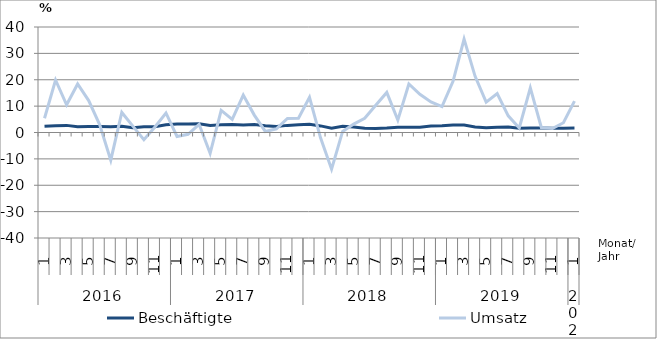
| Category | Beschäftigte | Umsatz |
|---|---|---|
| 0 | 2.4 | 5.4 |
| 1 | 2.6 | 19.9 |
| 2 | 2.7 | 10.5 |
| 3 | 2.2 | 18.4 |
| 4 | 2.3 | 12.1 |
| 5 | 2.3 | 2.9 |
| 6 | 2.2 | -10.5 |
| 7 | 2.4 | 7.6 |
| 8 | 1.8 | 2.4 |
| 9 | 2.2 | -2.7 |
| 10 | 2.2 | 2.1 |
| 11 | 2.9 | 7.4 |
| 12 | 3.2 | -1.5 |
| 13 | 3.2 | -0.7 |
| 14 | 3.3 | 3.1 |
| 15 | 2.7 | -7.9 |
| 16 | 2.9 | 8.4 |
| 17 | 3 | 5 |
| 18 | 2.8 | 14.2 |
| 19 | 3 | 6.6 |
| 20 | 2.6 | 0.4 |
| 21 | 2.3 | 1.4 |
| 22 | 2.7 | 5.3 |
| 23 | 2.9 | 5.4 |
| 24 | 3.1 | 13.3 |
| 25 | 2.5 | -2 |
| 26 | 1.6 | -13.9 |
| 27 | 2.4 | 0.4 |
| 28 | 2.1 | 3.2 |
| 29 | 1.6 | 5.4 |
| 30 | 1.5 | 10.3 |
| 31 | 1.7 | 15.2 |
| 32 | 2 | 4.7 |
| 33 | 2 | 18.4 |
| 34 | 2 | 14.5 |
| 35 | 2.5 | 11.6 |
| 36 | 2.6 | 9.8 |
| 37 | 2.8 | 19.4 |
| 38 | 2.8 | 35.4 |
| 39 | 2.1 | 21.3 |
| 40 | 1.8 | 11.5 |
| 41 | 2 | 14.8 |
| 42 | 2.1 | 6.3 |
| 43 | 1.6 | 1.7 |
| 44 | 1.7 | 16.9 |
| 45 | 1.7 | 1.9 |
| 46 | 1.6 | 1.5 |
| 47 | 1.6 | 3.7 |
| 48 | 1.7 | 11.9 |